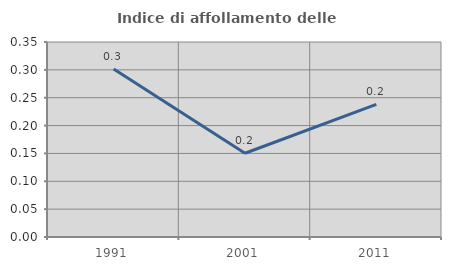
| Category | Indice di affollamento delle abitazioni  |
|---|---|
| 1991.0 | 0.302 |
| 2001.0 | 0.15 |
| 2011.0 | 0.238 |